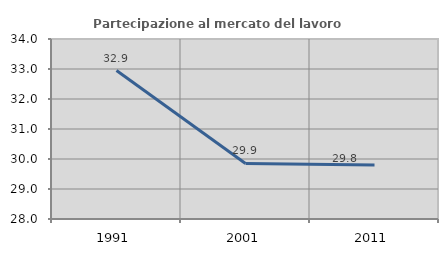
| Category | Partecipazione al mercato del lavoro  femminile |
|---|---|
| 1991.0 | 32.948 |
| 2001.0 | 29.851 |
| 2011.0 | 29.796 |